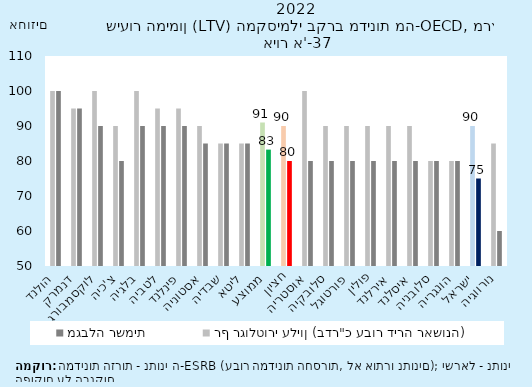
| Category | מגבלה רשמית | רף רגולטורי עליון (בדר"כ עבור דירה ראשונה) |
|---|---|---|
| נורווגיה | 60 | 85 |
| ישראל | 75 | 90 |
| הונגריה | 80 | 80 |
| סלובניה | 80 | 80 |
| איסלנד | 80 | 90 |
| אירלנד | 80 | 90 |
| פולין | 80 | 90 |
| פורטוגל | 80 | 90 |
| סלובקיה | 80 | 90 |
| אוסטריה | 80 | 100 |
| חציון | 80 | 90 |
| ממוצע | 83.25 | 91 |
| ליטא | 85 | 85 |
| שבדיה | 85 | 85 |
| אסטוניה | 85 | 90 |
| פינלנד | 90 | 95 |
| לטביה | 90 | 95 |
| בלגיה | 90 | 100 |
| צ'כיה | 80 | 90 |
| לוקסמבורג | 90 | 100 |
| דנמרק | 95 | 95 |
| הולנד | 100 | 100 |